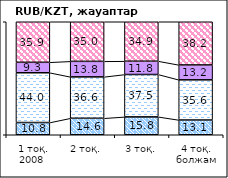
| Category | повысится | не изменится | снизится | не знаю |
|---|---|---|---|---|
| 1 тоқ. 2008  | 10.83 | 44.03 | 9.26 | 35.88 |
| 2 тоқ. | 14.59 | 36.63 | 13.75 | 35.03 |
| 3 тоқ. | 15.83 | 37.49 | 11.79 | 34.89 |
| 4 тоқ. болжам | 13.06 | 35.56 | 13.18 | 38.21 |